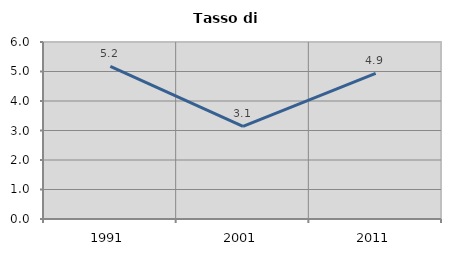
| Category | Tasso di disoccupazione   |
|---|---|
| 1991.0 | 5.174 |
| 2001.0 | 3.14 |
| 2011.0 | 4.937 |